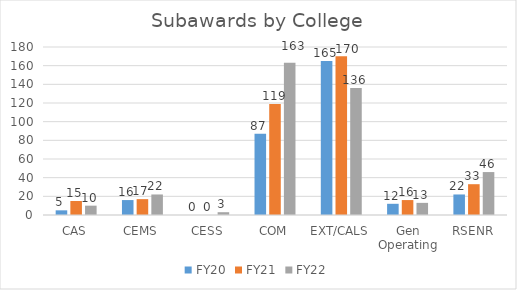
| Category | FY20 | FY21 | FY22 |
|---|---|---|---|
| CAS | 5 | 15 | 10 |
| CEMS | 16 | 17 | 22 |
| CESS | 0 | 0 | 3 |
| COM | 87 | 119 | 163 |
| EXT/CALS | 165 | 170 | 136 |
| Gen Operating | 12 | 16 | 13 |
| RSENR | 22 | 33 | 46 |